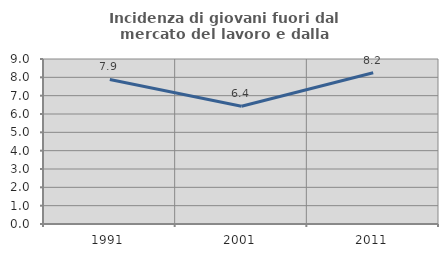
| Category | Incidenza di giovani fuori dal mercato del lavoro e dalla formazione  |
|---|---|
| 1991.0 | 7.886 |
| 2001.0 | 6.425 |
| 2011.0 | 8.249 |